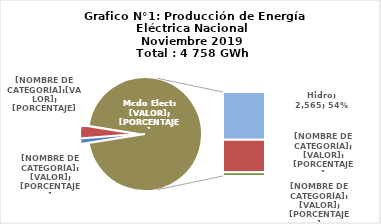
| Category | Series 0 |
|---|---|
| 0 | 63.088 |
| 1 | 179.558 |
| 2 | 2565.134 |
| 3 | 1746.293 |
| 4 | 203.693 |